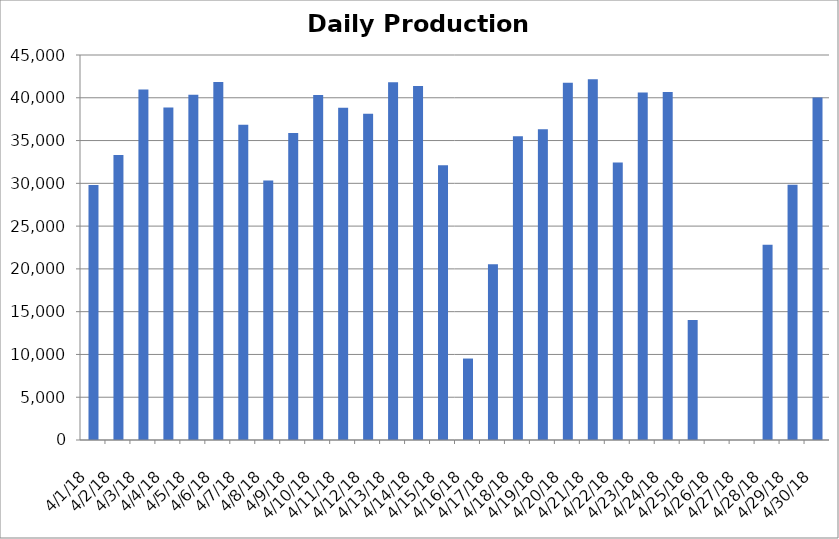
| Category | Series 0 |
|---|---|
| 4/1/18 | 29813 |
| 4/2/18 | 33315 |
| 4/3/18 | 40957 |
| 4/4/18 | 38856 |
| 4/5/18 | 40357 |
| 4/6/18 | 41854 |
| 4/7/18 | 36848 |
| 4/8/18 | 30324 |
| 4/9/18 | 35892 |
| 4/10/18 | 40312 |
| 4/11/18 | 38831 |
| 4/12/18 | 38139 |
| 4/13/18 | 41805 |
| 4/14/18 | 41372 |
| 4/15/18 | 32111 |
| 4/16/18 | 9522 |
| 4/17/18 | 20552 |
| 4/18/18 | 35515 |
| 4/19/18 | 36330 |
| 4/20/18 | 41767 |
| 4/21/18 | 42151 |
| 4/22/18 | 32436 |
| 4/23/18 | 40607 |
| 4/24/18 | 40672 |
| 4/25/18 | 14030 |
| 4/26/18 | 0 |
| 4/27/18 | 0 |
| 4/28/18 | 22810 |
| 4/29/18 | 29844 |
| 4/30/18 | 40019 |